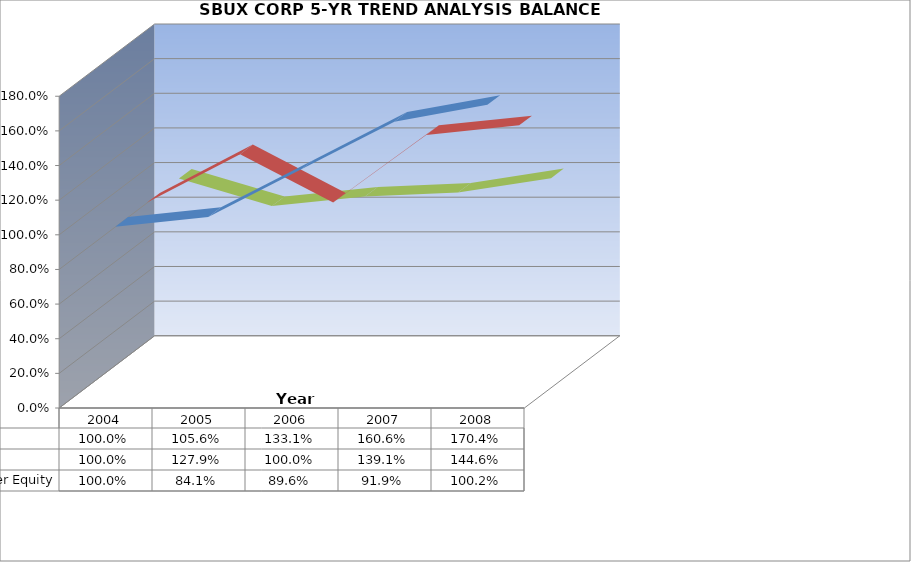
| Category | Assets | Liabilities | Shareholder Equity |
|---|---|---|---|
| 2008 | 1.704 | 1.446 | 1.002 |
| 2007 | 1.606 | 1.391 | 0.919 |
| 2006 | 1.331 | 1 | 0.896 |
| 2005 | 1.056 | 1.279 | 0.841 |
| 2004 | 1 | 1 | 1 |